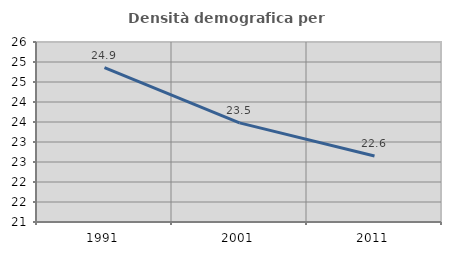
| Category | Densità demografica |
|---|---|
| 1991.0 | 24.86 |
| 2001.0 | 23.478 |
| 2011.0 | 22.649 |